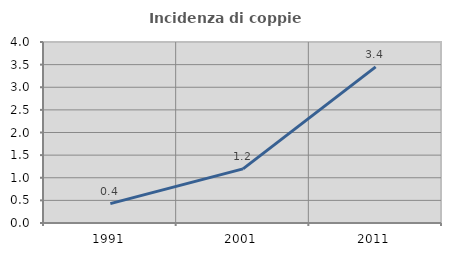
| Category | Incidenza di coppie miste |
|---|---|
| 1991.0 | 0.428 |
| 2001.0 | 1.195 |
| 2011.0 | 3.45 |